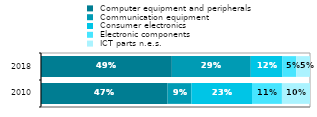
| Category |  Computer equipment and peripherals |  Communication equipment |  Consumer electronics |  Electronic components |  ICT parts n.e.s. |
|---|---|---|---|---|---|
| 2010.0 | 0.47 | 0.089 | 0.225 | 0.111 | 0.104 |
| 2018.0 | 0.486 | 0.293 | 0.118 | 0.051 | 0.051 |